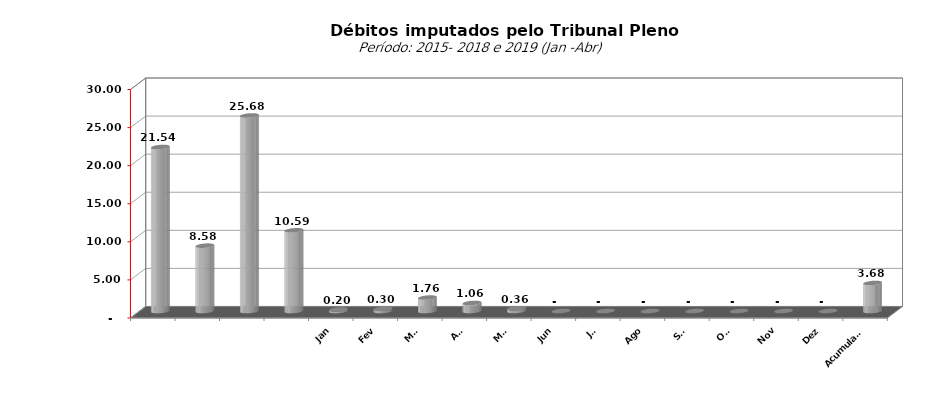
| Category |  7.073.154,74   5.749.129,25   4.727.033,51   16.081.820,48   21.535.723,60   8.578.266,09   25.676.499,17   10.592.915,18   197.255,77   296.375,09   1.764.671,00   1.058.511,33   358.973,08   -     -     -     -     -     -     -     3.675.786,27  |
|---|---|
|  | 21535723.6 |
|  | 8578266.09 |
|  | 25676499.17 |
|  | 10592915.18 |
| Jan | 197255.77 |
| Fev | 296375.09 |
| Mar | 1764671 |
| Abr | 1058511.33 |
| Mai | 358973.08 |
| Jun | 0 |
| Jul | 0 |
| Ago | 0 |
| Set | 0 |
| Out | 0 |
| Nov | 0 |
| Dez | 0 |
| Acumulado | 3675786.27 |